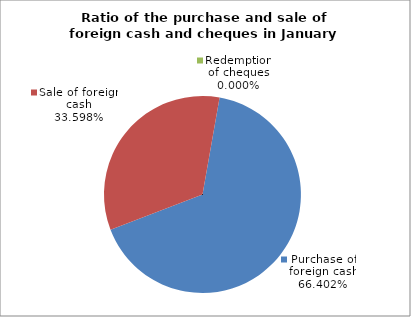
| Category | Purchase of foreign cash | Sale of foreign cash | Redemption of cheques |
|---|---|---|---|
|  | 0.664 | 0.336 | 0 |